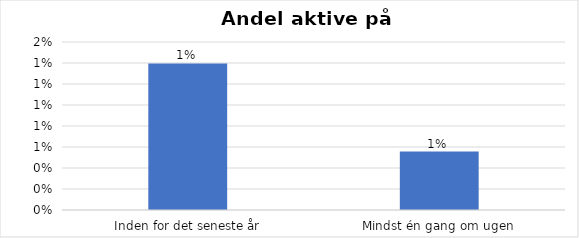
| Category | % |
|---|---|
| Inden for det seneste år | 0.014 |
| Mindst én gang om ugen | 0.006 |